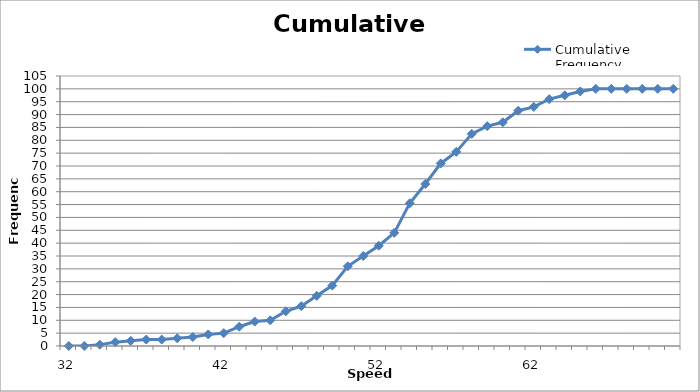
| Category | Cumulative Frequency |
|---|---|
| 32.0 | 0 |
| 33.0 | 0 |
| 34.0 | 0.5 |
| 35.0 | 1.5 |
| 36.0 | 2 |
| 37.0 | 2.5 |
| 38.0 | 2.5 |
| 39.0 | 3 |
| 40.0 | 3.5 |
| 41.0 | 4.5 |
| 42.0 | 5 |
| 43.0 | 7.5 |
| 44.0 | 9.5 |
| 45.0 | 10 |
| 46.0 | 13.5 |
| 47.0 | 15.5 |
| 48.0 | 19.5 |
| 49.0 | 23.5 |
| 50.0 | 31 |
| 51.0 | 35 |
| 52.0 | 39 |
| 53.0 | 44 |
| 54.0 | 55.5 |
| 55.0 | 63 |
| 56.0 | 71 |
| 57.0 | 75.5 |
| 58.0 | 82.5 |
| 59.0 | 85.5 |
| 60.0 | 87 |
| 61.0 | 91.5 |
| 62.0 | 93 |
| 63.0 | 96 |
| 64.0 | 97.5 |
| 65.0 | 99 |
| 66.0 | 100 |
| 67.0 | 100 |
| 68.0 | 100 |
| 69.0 | 100 |
| 70.0 | 100 |